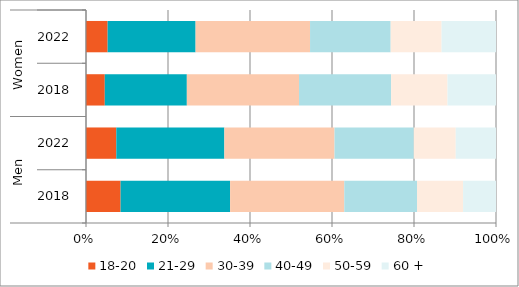
| Category | 18-20 | 21-29 | 30-39 | 40-49 | 50-59 | 60 + |
|---|---|---|---|---|---|---|
| 0 | 2260 | 7154 | 7457 | 4754 | 3008 | 2149 |
| 1 | 1738 | 6196 | 6317 | 4545 | 2405 | 2309 |
| 2 | 136 | 594 | 812 | 667 | 408 | 351 |
| 3 | 142 | 577 | 751 | 529 | 334 | 357 |